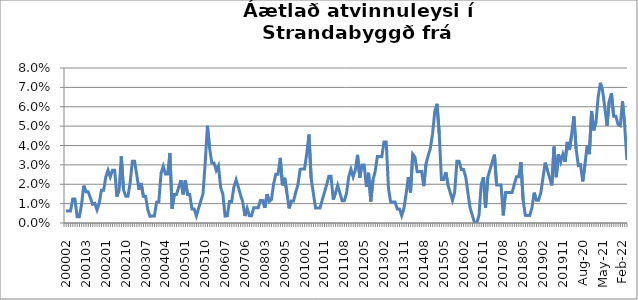
| Category | Series 0 |
|---|---|
| 200002 | 0.006 |
| 200003 | 0.006 |
| 200004 | 0.006 |
| 200005 | 0.012 |
| 200006 | 0.012 |
| 200007 | 0.003 |
| 200011 | 0.003 |
| 200012 | 0.01 |
| 200101 | 0.019 |
| 200103 | 0.016 |
| 200104 | 0.016 |
| 200105 | 0.013 |
| 200106 | 0.01 |
| 200107 | 0.01 |
| 200108 | 0.007 |
| 200110 | 0.01 |
| 200111 | 0.017 |
| 200112 | 0.017 |
| 200201 | 0.024 |
| 200202 | 0.027 |
| 200203 | 0.024 |
| 200204 | 0.027 |
| 200205 | 0.027 |
| 200206 | 0.014 |
| 200207 | 0.017 |
| 200208 | 0.034 |
| 200209 | 0.017 |
| 200210 | 0.014 |
| 200211 | 0.014 |
| 200212 | 0.021 |
| 200301 | 0.032 |
| 200302 | 0.032 |
| 200303 | 0.025 |
| 200304 | 0.017 |
| 200305 | 0.021 |
| 200306 | 0.014 |
| 200307 | 0.014 |
| 200308 | 0.007 |
| 200309 | 0.003 |
| 200310 | 0.004 |
| 200311 | 0.004 |
| 200312 | 0.011 |
| 200401 | 0.011 |
| 200402 | 0.026 |
| 200403 | 0.029 |
| 200404 | 0.025 |
| 200405 | 0.025 |
| 200406 | 0.036 |
| 200407 | 0.007 |
| 200408 | 0.015 |
| 200409 | 0.015 |
| 200410 | 0.018 |
| 200411 | 0.022 |
| 200412 | 0.015 |
| 200501 | 0.022 |
| 200502 | 0.015 |
| 200503 | 0.015 |
| 200504 | 0.007 |
| 200505 | 0.007 |
| 200506 | 0.004 |
| 200507 | 0.008 |
| 200508 | 0.011 |
| 200509 | 0.015 |
| 200510 | 0.031 |
| 200511 | 0.05 |
| 200512 | 0.039 |
| 200601 | 0.031 |
| 200602 | 0.031 |
| 200603 | 0.027 |
| 200604 | 0.03 |
| 200605 | 0.018 |
| 200606 | 0.015 |
| 200607 | 0.004 |
| 200610 | 0.004 |
| 200611 | 0.011 |
| 200612 | 0.011 |
| 200701 | 0.019 |
| 200702 | 0.022 |
| 200703 | 0.019 |
| 200704 | 0.014 |
| 200705 | 0.011 |
| 200706 | 0.004 |
| 200707 | 0.008 |
| 200708 | 0.004 |
| 200709 | 0.004 |
| 200710 | 0.008 |
| 200711 | 0.008 |
| 200712 | 0.008 |
| 200801 | 0.012 |
| 200802 | 0.012 |
| 200803 | 0.008 |
| 200804 | 0.015 |
| 200805 | 0.011 |
| 200811 | 0.012 |
| 200812 | 0.02 |
| 200901 | 0.025 |
| 200902 | 0.025 |
| 200903 | 0.034 |
| 200904 | 0.019 |
| 200905 | 0.023 |
| 200906 | 0.016 |
| 200907 | 0.008 |
| 200908 | 0.011 |
| 200909 | 0.011 |
| 200910 | 0.016 |
| 200911 | 0.02 |
| 200912 | 0.028 |
| 201001 | 0.028 |
| 201002 | 0.028 |
| 201003 | 0.036 |
| 201004 | 0.046 |
| 201005 | 0.023 |
| 201006 | 0.015 |
| 201007 | 0.008 |
| 201008 | 0.008 |
| 201009 | 0.008 |
| 201010 | 0.012 |
| 201011 | 0.016 |
| 201012 | 0.02 |
| 201101 | 0.024 |
| 201102 | 0.024 |
| 201103 | 0.012 |
| 201104 | 0.016 |
| 201105 | 0.019 |
| 201106 | 0.016 |
| 201107 | 0.011 |
| 201108 | 0.011 |
| 201109 | 0.015 |
| 201110 | 0.024 |
| 201111 | 0.028 |
| 201112 | 0.024 |
| 201201 | 0.027 |
| 201202 | 0.035 |
| 201203 | 0.023 |
| 201204 | 0.03 |
| 201205 | 0.03 |
| 201206 | 0.019 |
| 201207 | 0.026 |
| 201208 | 0.011 |
| 201209 | 0.022 |
| 201210 | 0.027 |
| 201211 | 0.034 |
| 201212 | 0.034 |
| 201301 | 0.034 |
| 201302 | 0.042 |
| 201303 | 0.042 |
| 201304 | 0.018 |
| 201305 | 0.011 |
| 201306 | 0.011 |
| 201307 | 0.011 |
| 201308 | 0.007 |
| 201309 | 0.007 |
| 201310 | 0.004 |
| 201311 | 0.007 |
| 201312 | 0.015 |
| 201401 | 0.024 |
| 201402 | 0.016 |
| 201403 | 0.036 |
| 201404 | 0.034 |
| 201405 | 0.027 |
| 201406 | 0.027 |
| 201407 | 0.027 |
| 201408 | 0.019 |
| 201409 | 0.03 |
| 201410 | 0.035 |
| 201411 | 0.039 |
| 201412 | 0.046 |
| 201501 | 0.058 |
| 201502 | 0.062 |
| 201503 | 0.046 |
| 201504 | 0.022 |
| 201505 | 0.022 |
| 201506 | 0.026 |
| 201507 | 0.02 |
| 201508 | 0.016 |
| 201509 | 0.012 |
| 201510 | 0.016 |
| 201511 | 0.032 |
| 201512 | 0.032 |
| 201601 | 0.028 |
| 201602 | 0.028 |
| 201603 | 0.024 |
| 201604 | 0.016 |
| 201605 | 0.008 |
| 201606 | 0.004 |
| 201607 | 0 |
| 201608 | 0 |
| 201609 | 0.004 |
| 201610 | 0.02 |
| 201611 | 0.024 |
| 201612 | 0.008 |
| 201701 | 0.024 |
| 201702 | 0.028 |
| 201703 | 0.031 |
| 201704 | 0.035 |
| 201705 | 0.02 |
| 201706 | 0.02 |
| 201707 | 0.02 |
| 201708 | 0.004 |
| 201709 | 0.016 |
| 201710 | 0.016 |
| 201711 | 0.016 |
| 201712 | 0.016 |
| 201801 | 0.02 |
| 201802 | 0.024 |
| 201803 | 0.024 |
| 201804 | 0.031 |
| 201805 | 0.012 |
| 201806 | 0.004 |
| 201807 | 0.004 |
| 201808 | 0.004 |
| 201809 | 0.008 |
| 201810 | 0.016 |
| 201811 | 0.012 |
| 201812 | 0.012 |
| 201901 | 0.016 |
| 201902 | 0.023 |
| 201903 | 0.031 |
| 201904 | 0.027 |
| 201905 | 0.023 |
| 201906 | 0.019 |
| 201907 | 0.039 |
| 201908 | 0.024 |
| 201909 | 0.035 |
| 201910 | 0.031 |
| 201911 | 0.035 |
| 201912 | 0.031 |
| 202001 | 0.042 |
| feb.20 | 0.038 |
| mar.20 | 0.046 |
| apr.20 | 0.055 |
| maí.20 | 0.038 |
| jún.20 | 0.03 |
| júl.20 | 0.03 |
| ágú.20 | 0.021 |
| sep.20 | 0.03 |
| okt.20 | 0.04 |
| nóv.20 | 0.036 |
| des.20 | 0.058 |
| jan.21 | 0.048 |
| feb.21 | 0.052 |
| mar.21 | 0.065 |
| apr.21 | 0.072 |
| maí.21 | 0.068 |
| jún.21 | 0.06 |
| júl.21 | 0.05 |
| ágú.21 | 0.063 |
| sep.21 | 0.067 |
| okt.21 | 0.055 |
| nóv.21 | 0.055 |
| des.21 | 0.051 |
| jan.22 | 0.05 |
| feb.22 | 0.063 |
| mar.22 | 0.05 |
| apr.22 | 0.033 |